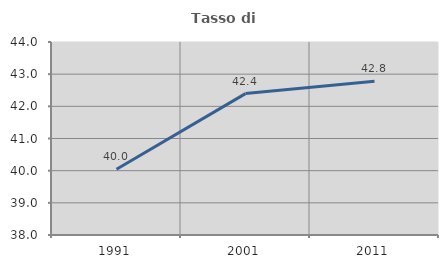
| Category | Tasso di occupazione   |
|---|---|
| 1991.0 | 40.043 |
| 2001.0 | 42.395 |
| 2011.0 | 42.777 |